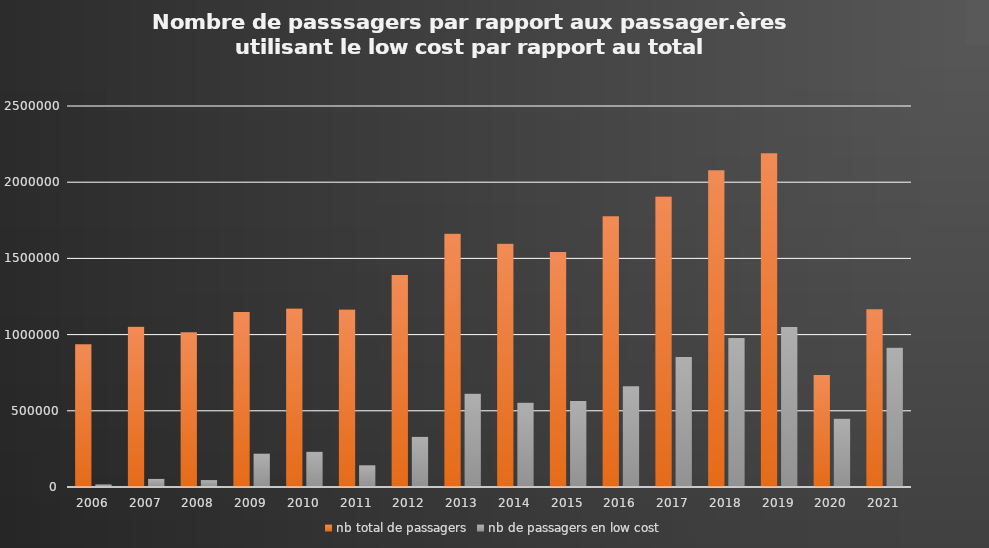
| Category | nb total de passagers | nb de passagers en low cost |
|---|---|---|
| 2006.0 | 936032 | 16844 |
| 2007.0 | 1051758 | 53046 |
| 2008.0 | 1014704 | 45385 |
| 2009.0 | 1147924 | 219247 |
| 2010.0 | 1170693 | 230858 |
| 2011.0 | 1164631 | 142386 |
| 2012.0 | 1391637 | 328734 |
| 2013.0 | 1661741 | 611453 |
| 2014.0 | 1596700 | 553243 |
| 2015.0 | 1541894 | 563933 |
| 2016.0 | 1776715 | 660625 |
| 2017.0 | 1905608 | 852334 |
| 2018.0 | 2078549 | 977793 |
| 2019.0 | 2189221 | 1050466 |
| 2020.0 | 734982 | 448397 |
| 2021.0 | 1167042 | 913756 |